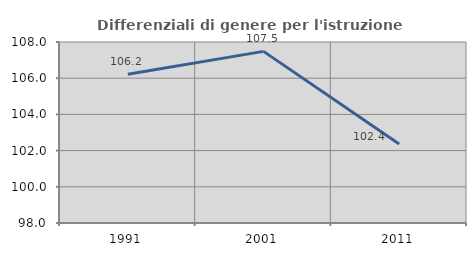
| Category | Differenziali di genere per l'istruzione superiore |
|---|---|
| 1991.0 | 106.217 |
| 2001.0 | 107.482 |
| 2011.0 | 102.369 |